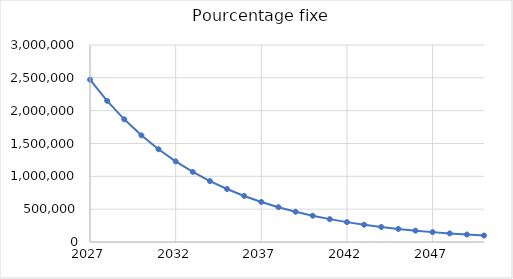
| Category | Pourcentage fixe |
|---|---|
| 2027.0 | 2471976 |
| 2028.0 | 2149063.013 |
| 2029.0 | 1868331.988 |
| 2030.0 | 1624272.716 |
| 2031.0 | 1412094.785 |
| 2032.0 | 1227633.55 |
| 2033.0 | 1067268.394 |
| 2034.0 | 927851.658 |
| 2035.0 | 806646.861 |
| 2036.0 | 701274.985 |
| 2037.0 | 609667.785 |
| 2038.0 | 530027.188 |
| 2039.0 | 460790.002 |
| 2040.0 | 400597.235 |
| 2041.0 | 348267.418 |
| 2042.0 | 302773.42 |
| 2043.0 | 263222.28 |
| 2044.0 | 228837.685 |
| 2045.0 | 198944.733 |
| 2046.0 | 172956.682 |
| 2047.0 | 150363.437 |
| 2048.0 | 130721.537 |
| 2049.0 | 113645.448 |
| 2050.0 | 98800 |